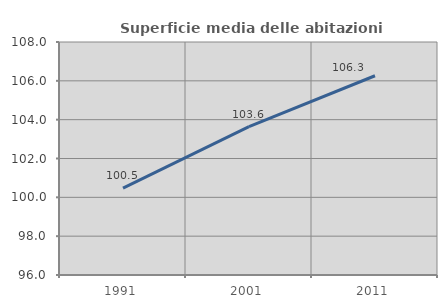
| Category | Superficie media delle abitazioni occupate |
|---|---|
| 1991.0 | 100.476 |
| 2001.0 | 103.637 |
| 2011.0 | 106.262 |